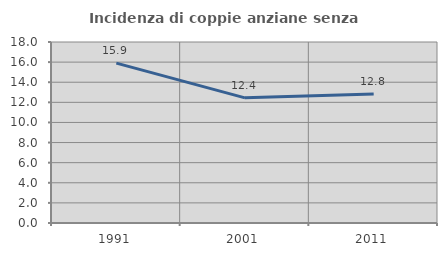
| Category | Incidenza di coppie anziane senza figli  |
|---|---|
| 1991.0 | 15.899 |
| 2001.0 | 12.447 |
| 2011.0 | 12.821 |